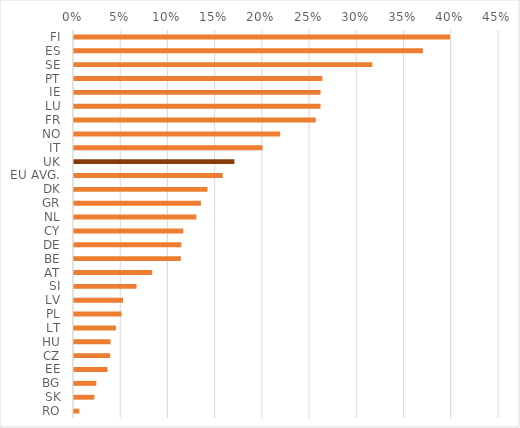
| Category | mean |
|---|---|
| FI | 0.398 |
| ES | 0.369 |
| SE | 0.316 |
| PT | 0.263 |
| IE | 0.261 |
| LU | 0.261 |
| FR | 0.256 |
| NO | 0.218 |
| IT | 0.2 |
| UK | 0.17 |
| EU AVG. | 0.157 |
| DK | 0.141 |
| GR | 0.134 |
| NL | 0.13 |
| CY | 0.116 |
| DE | 0.114 |
| BE | 0.113 |
| AT | 0.083 |
| SI | 0.066 |
| LV | 0.052 |
| PL | 0.05 |
| LT | 0.044 |
| HU | 0.039 |
| CZ | 0.038 |
| EE | 0.036 |
| BG | 0.024 |
| SK | 0.022 |
| RO | 0.006 |